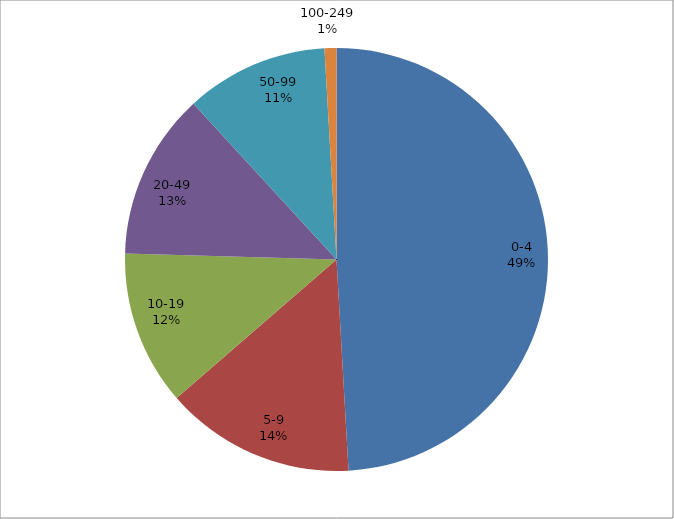
| Category | Series 0 |
|---|---|
| 0-4 | 54 |
| 5-9 | 16 |
| 10-19 | 13 |
| 20-49 | 14 |
| 50-99 | 12 |
| 100-249 | 1 |